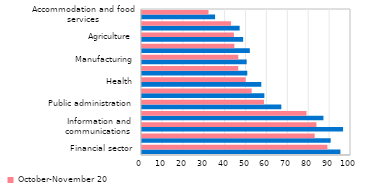
| Category | October-November 2019 | October-November 2018 |
|---|---|---|
| Financial sector | 94.929 | 88.736 |
| Energy | 90.281 | 82.637 |
| Information and communications  | 96.215 | 83.456 |
| Mining | 86.8 | 78.708 |
| Public administration | 66.655 | 58.355 |
| Education | 58.54 | 52.473 |
| Health | 57.085 | 49.6 |
| Transport and storage  | 50.379 | 46.069 |
| Manufacturing | 50.083 | 46.088 |
| Construction | 51.585 | 44.194 |
| Agriculture | 48.391 | 43.967 |
| Trade | 46.722 | 42.569 |
| Accommodation and food services | 34.973 | 31.82 |